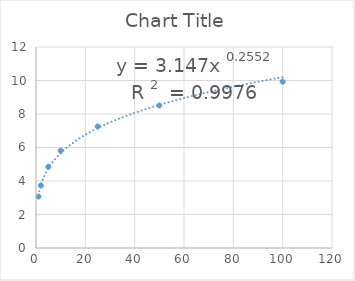
| Category | Series 0 |
|---|---|
| 1.0 | 3.07 |
| 2.0 | 3.73 |
| 5.0 | 4.85 |
| 10.0 | 5.81 |
| 25.0 | 7.26 |
| 50.0 | 8.51 |
| 100.0 | 9.93 |